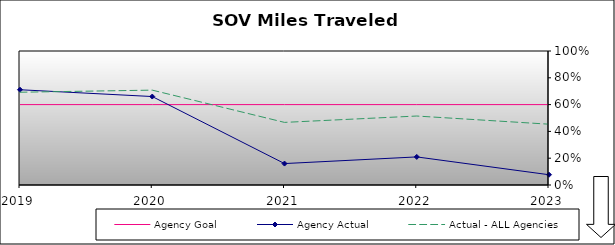
| Category | Agency Goal | Agency Actual | Actual - ALL Agencies |
|---|---|---|---|
| 2019.0 | 0.6 | 0.711 | 0.692 |
| 2020.0 | 0.6 | 0.66 | 0.708 |
| 2021.0 | 0.6 | 0.16 | 0.467 |
| 2022.0 | 0.6 | 0.21 | 0.515 |
| 2023.0 | 0.6 | 0.076 | 0.454 |